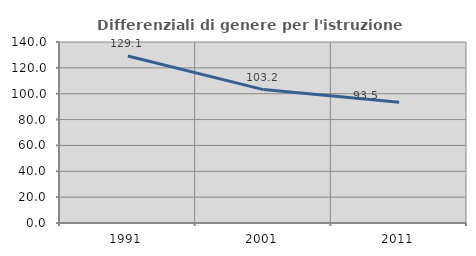
| Category | Differenziali di genere per l'istruzione superiore |
|---|---|
| 1991.0 | 129.11 |
| 2001.0 | 103.193 |
| 2011.0 | 93.47 |